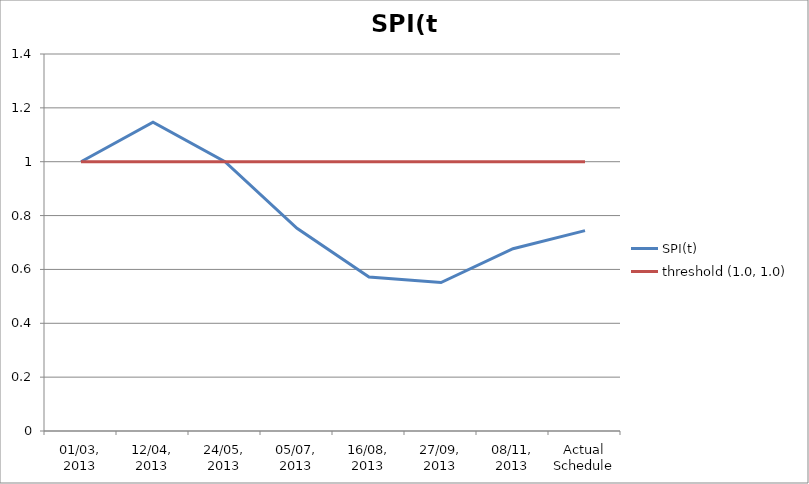
| Category | SPI(t) | threshold (1.0, 1.0) |
|---|---|---|
| 01/03, 2013 | 1 | 1 |
| 12/04, 2013 | 1.147 | 1 |
| 24/05, 2013 | 1 | 1 |
| 05/07, 2013 | 0.753 | 1 |
| 16/08, 2013 | 0.572 | 1 |
| 27/09, 2013 | 0.552 | 1 |
| 08/11, 2013 | 0.677 | 1 |
| Actual Schedule | 0.744 | 1 |